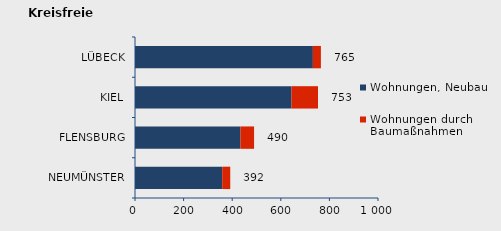
| Category | Wohnungen, Neubau | Wohnungen durch Baumaßnahmen | Series 2 |
|---|---|---|---|
| NEUMÜNSTER | 359 | 33 | 392 |
| FLENSBURG | 434 | 56 | 490 |
| KIEL | 644 | 109 | 753 |
| LÜBECK | 732 | 33 | 765 |